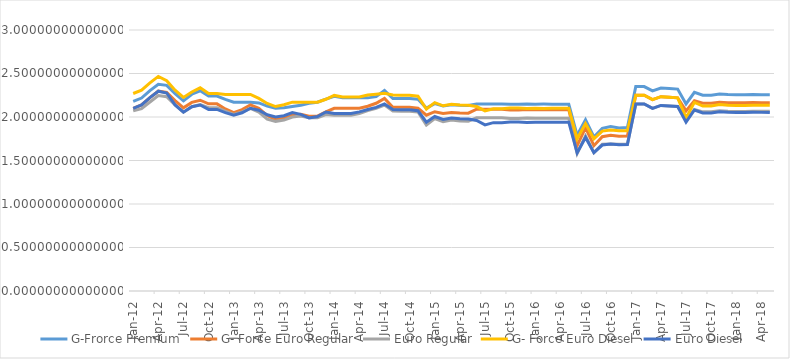
| Category | G-Frorce Premium | G- Force Euro Regular | Euro Regular | G- Force Euro Diesel | Euro Diesel |
|---|---|---|---|---|---|
| 2012-01-01 | 2.18 | 2.1 | 2.07 | 2.27 | 2.1 |
| 2012-02-01 | 2.218 | 2.138 | 2.096 | 2.308 | 2.138 |
| 2012-03-01 | 2.303 | 2.223 | 2.173 | 2.393 | 2.223 |
| 2012-04-01 | 2.377 | 2.297 | 2.247 | 2.467 | 2.297 |
| 2012-05-01 | 2.364 | 2.284 | 2.234 | 2.417 | 2.276 |
| 2012-06-01 | 2.268 | 2.188 | 2.138 | 2.308 | 2.138 |
| 2012-07-01 | 2.185 | 2.105 | 2.055 | 2.225 | 2.055 |
| 2012-08-01 | 2.262 | 2.168 | 2.118 | 2.288 | 2.118 |
| 2012-09-01 | 2.302 | 2.193 | 2.143 | 2.335 | 2.138 |
| 2012-10-01 | 2.241 | 2.151 | 2.107 | 2.271 | 2.087 |
| 2012-11-01 | 2.241 | 2.151 | 2.107 | 2.271 | 2.087 |
| 2012-12-01 | 2.203 | 2.093 | 2.067 | 2.26 | 2.051 |
| 2013-01-01 | 2.17 | 2.05 | 2.03 | 2.26 | 2.02 |
| 2013-02-01 | 2.17 | 2.084 | 2.059 | 2.26 | 2.049 |
| 2013-03-01 | 2.17 | 2.14 | 2.1 | 2.26 | 2.1 |
| 2013-04-01 | 2.161 | 2.101 | 2.057 | 2.213 | 2.078 |
| 2013-05-01 | 2.126 | 2.016 | 1.976 | 2.156 | 2.026 |
| 2013-06-01 | 2.1 | 1.97 | 1.95 | 2.12 | 2 |
| 2013-07-01 | 2.106 | 1.985 | 1.965 | 2.14 | 2.015 |
| 2013-08-01 | 2.12 | 2.02 | 2 | 2.171 | 2.05 |
| 2013-09-01 | 2.136 | 2.032 | 2.012 | 2.17 | 2.031 |
| 2013-10-01 | 2.158 | 2.01 | 1.99 | 2.17 | 1.99 |
| 2013-11-01 | 2.17 | 2.01 | 1.99 | 2.17 | 2.006 |
| 2013-12-01 | 2.205 | 2.059 | 2.028 | 2.204 | 2.058 |
| 2014-01-01 | 2.238 | 2.1 | 2.02 | 2.248 | 2.04 |
| 2014-02-01 | 2.22 | 2.1 | 2.02 | 2.23 | 2.04 |
| 2014-03-01 | 2.22 | 2.1 | 2.02 | 2.23 | 2.04 |
| 2014-04-01 | 2.22 | 2.1 | 2.039 | 2.23 | 2.059 |
| 2014-05-01 | 2.22 | 2.123 | 2.073 | 2.253 | 2.087 |
| 2014-06-01 | 2.234 | 2.158 | 2.101 | 2.263 | 2.111 |
| 2014-07-01 | 2.305 | 2.213 | 2.137 | 2.273 | 2.151 |
| 2014-08-01 | 2.213 | 2.112 | 2.068 | 2.253 | 2.086 |
| 2014-09-01 | 2.214 | 2.111 | 2.067 | 2.25 | 2.083 |
| 2014-10-01 | 2.214 | 2.111 | 2.067 | 2.25 | 2.083 |
| 2014-11-01 | 2.205 | 2.101 | 2.058 | 2.238 | 2.072 |
| 2014-12-01 | 2.102 | 2.02 | 1.908 | 2.092 | 1.94 |
| 2015-01-01 | 2.154 | 2.061 | 1.983 | 2.165 | 2.006 |
| 2015-02-01 | 2.128 | 2.041 | 1.946 | 2.129 | 1.973 |
| 2015-03-01 | 2.141 | 2.051 | 1.964 | 2.147 | 1.989 |
| 2015-04-01 | 2.134 | 2.046 | 1.955 | 2.138 | 1.981 |
| 2015-05-01 | 2.132 | 2.044 | 1.951 | 2.134 | 1.978 |
| 2015-06-01 | 2.15 | 2.09 | 1.99 | 2.12 | 1.96 |
| 2015-07-01 | 2.15 | 2.09 | 1.99 | 2.07 | 1.91 |
| 2015-08-01 | 2.15 | 2.09 | 1.99 | 2.095 | 1.935 |
| 2015-09-01 | 2.15 | 2.09 | 1.99 | 2.095 | 1.935 |
| 2015-10-01 | 2.146 | 2.081 | 1.982 | 2.103 | 1.944 |
| 2015-11-01 | 2.146 | 2.081 | 1.982 | 2.103 | 1.944 |
| 2015-12-01 | 2.149 | 2.087 | 1.987 | 2.098 | 1.938 |
| 2016-01-01 | 2.148 | 2.084 | 1.985 | 2.1 | 1.941 |
| 2016-02-01 | 2.148 | 2.085 | 1.986 | 2.099 | 1.939 |
| 2016-03-01 | 2.147 | 2.084 | 1.985 | 2.1 | 1.941 |
| 2016-04-01 | 2.148 | 2.084 | 1.985 | 2.1 | 1.94 |
| 2016-05-01 | 2.148 | 2.084 | 1.985 | 2.1 | 1.941 |
| 2016-06-01 | 1.79 | 1.67 | 1.58 | 1.75 | 1.59 |
| 2016-07-01 | 1.969 | 1.877 | 1.782 | 1.925 | 1.765 |
| 2016-08-01 | 1.77 | 1.67 | 1.59 | 1.75 | 1.59 |
| 2016-09-01 | 1.869 | 1.773 | 1.686 | 1.838 | 1.678 |
| 2016-10-01 | 1.89 | 1.79 | 1.69 | 1.85 | 1.69 |
| 2016-11-01 | 1.875 | 1.778 | 1.687 | 1.841 | 1.681 |
| 2016-12-01 | 1.878 | 1.78 | 1.688 | 1.843 | 1.683 |
| 2017-01-01 | 2.35 | 2.25 | 2.15 | 2.25 | 2.15 |
| 2017-02-01 | 2.35 | 2.25 | 2.15 | 2.25 | 2.15 |
| 2017-03-01 | 2.3 | 2.2 | 2.1 | 2.2 | 2.1 |
| 2017-04-01 | 2.333 | 2.233 | 2.133 | 2.233 | 2.133 |
| 2017-05-01 | 2.328 | 2.228 | 2.128 | 2.228 | 2.128 |
| 2017-06-01 | 2.32 | 2.22 | 2.12 | 2.22 | 2.12 |
| 2017-07-01 | 2.15 | 2.07 | 1.97 | 1.99 | 1.94 |
| 2017-08-01 | 2.283 | 2.188 | 2.088 | 2.168 | 2.08 |
| 2017-09-01 | 2.251 | 2.159 | 2.059 | 2.126 | 2.047 |
| 2017-10-01 | 2.251 | 2.159 | 2.059 | 2.126 | 2.047 |
| 2017-11-01 | 2.264 | 2.171 | 2.071 | 2.143 | 2.06 |
| 2017-12-01 | 2.257 | 2.165 | 2.065 | 2.135 | 2.054 |
| 2018-01-01 | 2.256 | 2.164 | 2.064 | 2.132 | 2.052 |
| 2018-02-01 | 2.257 | 2.164 | 2.064 | 2.133 | 2.053 |
| 2018-03-01 | 2.258 | 2.166 | 2.066 | 2.136 | 2.055 |
| 2018-04-01 | 2.257 | 2.165 | 2.065 | 2.134 | 2.053 |
| 2018-05-01 | 2.257 | 2.165 | 2.065 | 2.134 | 2.053 |